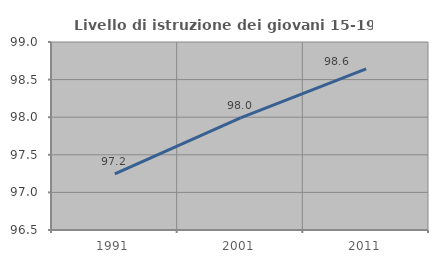
| Category | Livello di istruzione dei giovani 15-19 anni |
|---|---|
| 1991.0 | 97.246 |
| 2001.0 | 97.99 |
| 2011.0 | 98.643 |